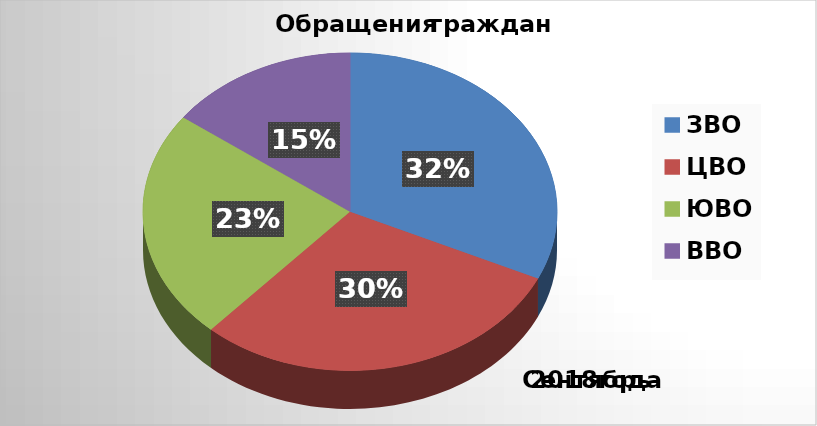
| Category | Series 0 |
|---|---|
| ЗВО | 30 |
| ЦВО | 28 |
| ЮВО | 22 |
| ВВО | 14 |